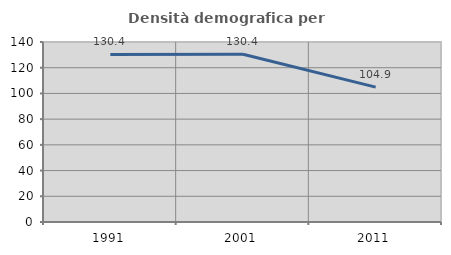
| Category | Densità demografica |
|---|---|
| 1991.0 | 130.356 |
| 2001.0 | 130.449 |
| 2011.0 | 104.908 |